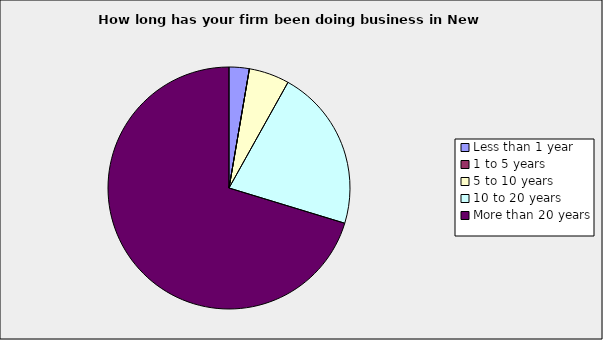
| Category | Series 0 |
|---|---|
| Less than 1 year | 0.027 |
| 1 to 5 years | 0 |
| 5 to 10 years | 0.054 |
| 10 to 20 years | 0.216 |
| More than 20 years | 0.703 |